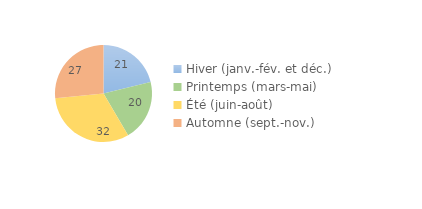
| Category | Series 0 |
|---|---|
| Hiver (janv.-fév. et déc.) | 21.209 |
| Printemps (mars-mai) | 20.349 |
| Été (juin-août) | 31.867 |
| Automne (sept.-nov.) | 26.575 |